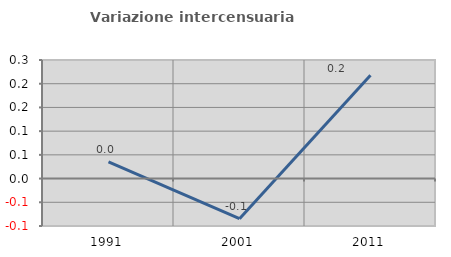
| Category | Variazione intercensuaria annua |
|---|---|
| 1991.0 | 0.035 |
| 2001.0 | -0.085 |
| 2011.0 | 0.218 |